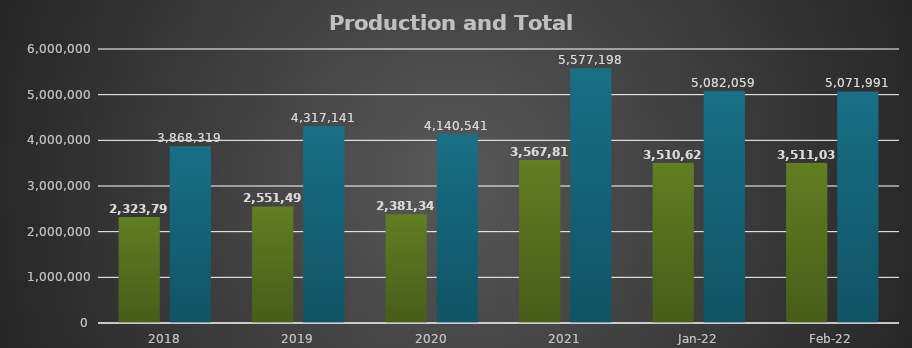
| Category | Production Ha | Total Ha* |
|---|---|---|
| 2018.0 | 2323798.97 | 3868318.93 |
| 2019.0 | 2551499 | 4317141 |
| 2020.0 | 2381340.48 | 4140541.15 |
| 2021.0 | 3567815 | 5577198 |
| 44592.0 | 3510623 | 5082059 |
| 44620.0 | 3511035 | 5071991 |